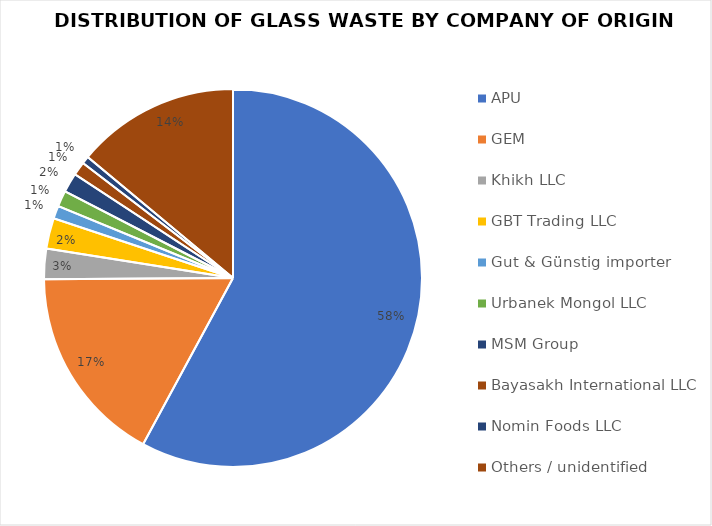
| Category | Series 0 |
|---|---|
| APU | 908.66 |
| GEM | 266.81 |
| Khikh LLC | 40.964 |
| GBT Trading LLC | 40.96 |
| Gut & Günstig importer | 17.36 |
| Urbanek Mongol LLC | 21.35 |
| MSM Group | 26.215 |
| Bayasakh International LLC | 18.22 |
| Nomin Foods LLC | 10.12 |
| Others / unidentified | 218.97 |